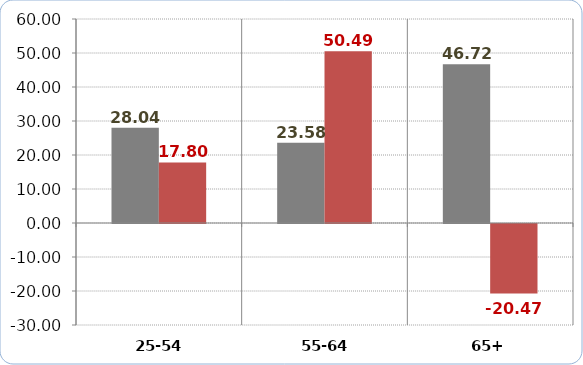
| Category | Real Income (07-15 percentage change) | People in Relative Poverty (07-15 percentage change) |
|---|---|---|
| 25-54 | 28.042 | 17.799 |
| 55-64 | 23.584 | 50.49 |
| 65+ | 46.723 | -20.468 |